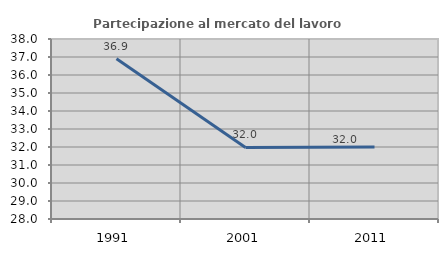
| Category | Partecipazione al mercato del lavoro  femminile |
|---|---|
| 1991.0 | 36.9 |
| 2001.0 | 31.976 |
| 2011.0 | 32.005 |